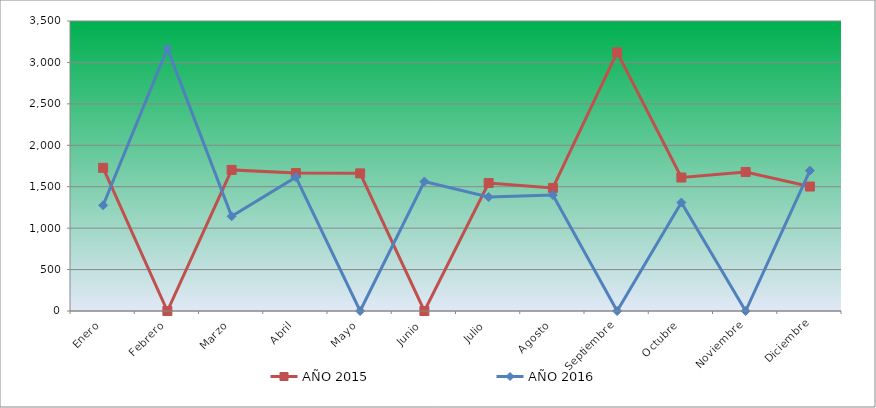
| Category | AÑO 2015 | AÑO 2016 |
|---|---|---|
| Enero | 1728.072 | 1276.015 |
| Febrero | 0 | 3169.322 |
| Marzo | 1702.967 | 1143.442 |
| Abril | 1665.309 | 1615.733 |
| Mayo | 1661.125 | 0 |
| Junio | 0 | 1561.875 |
| Julio | 1543.967 | 1375.444 |
| Agosto | 1485.389 | 1400.302 |
| Septiembre | 3121.408 | 0 |
| Octubre | 1610.914 | 1309.158 |
| Noviembre | 1677.861 | 0 |
| Diciembre | 1502.125 | 1694.448 |